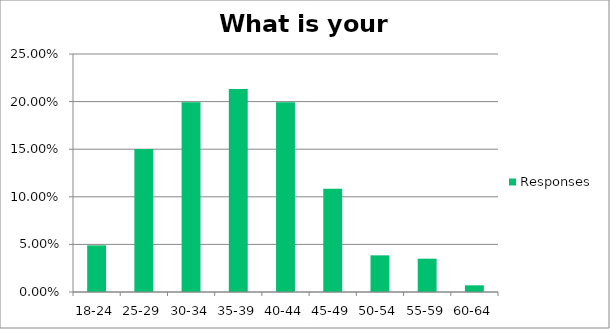
| Category | Responses |
|---|---|
| 18-24 | 0.049 |
| 25-29 | 0.15 |
| 30-34 | 0.199 |
| 35-39 | 0.213 |
| 40-44 | 0.199 |
| 45-49 | 0.108 |
| 50-54 | 0.038 |
| 55-59 | 0.035 |
| 60-64 | 0.007 |